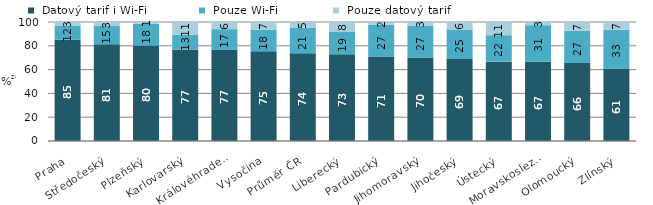
| Category |  Datový tarif i Wi-Fi |  Pouze Wi-Fi |  Pouze datový tarif |
|---|---|---|---|
|   Praha | 85.1 | 11.9 | 3 |
|   Středočeský | 81.4 | 15.2 | 3.4 |
|   Plzeňský | 80.2 | 18.4 | 1.4 |
|   Karlovarský | 76.7 | 12.7 | 10.6 |
|   Královéhradecký | 76.6 | 17.4 | 6 |
|   Vysočina | 75.4 | 18 | 6.6 |
| Průměr ČR | 73.7 | 21.4 | 4.9 |
|   Liberecký | 73 | 18.6 | 8.4 |
|   Pardubický | 71 | 26.6 | 2.4 |
|   Jihomoravský | 69.9 | 26.9 | 3.2 |
|   Jihočeský | 68.9 | 24.8 | 6.3 |
|   Ústecký | 66.7 | 22.2 | 11.1 |
|   Moravskoslezský | 66.6 | 30.7 | 2.7 |
|   Olomoucký | 65.6 | 27 | 7.4 |
|   Zlínský | 60.9 | 32.6 | 6.5 |